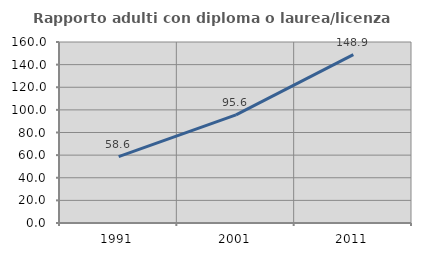
| Category | Rapporto adulti con diploma o laurea/licenza media  |
|---|---|
| 1991.0 | 58.649 |
| 2001.0 | 95.601 |
| 2011.0 | 148.852 |